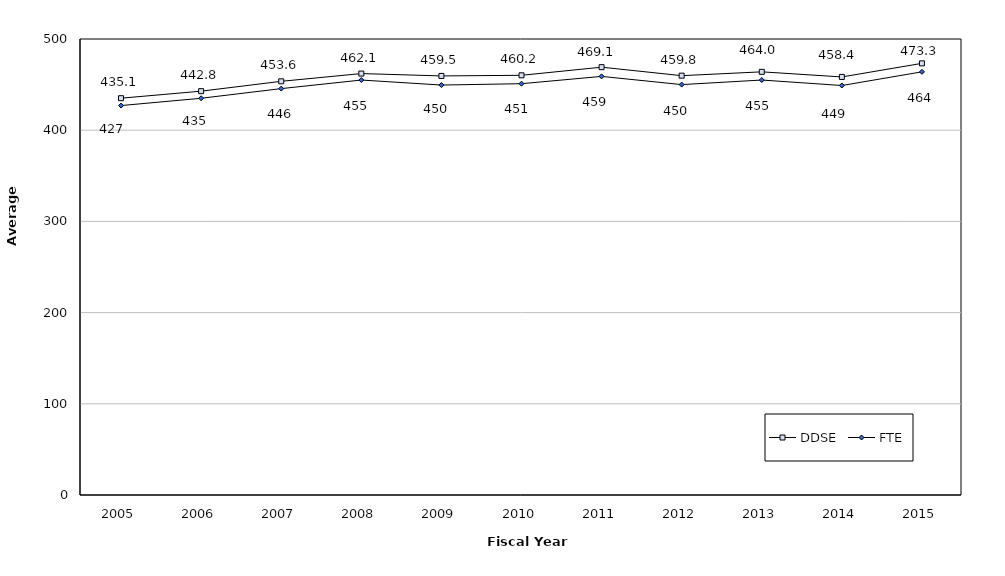
| Category | DDSE |
|---|---|
| 2005.0 | 435.1 |
| 2006.0 | 442.8 |
| 2007.0 | 453.6 |
| 2008.0 | 462.1 |
| 2009.0 | 459.5 |
| 2010.0 | 460.2 |
| 2011.0 | 469.1 |
| 2012.0 | 459.8 |
| 2013.0 | 464 |
| 2014.0 | 458.4 |
| 2015.0 | 473.3 |